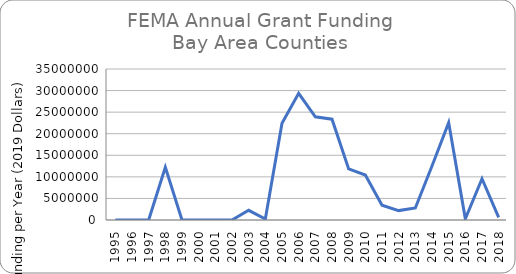
| Category | Series 0 |
|---|---|
| 1995.0 | 0 |
| 1996.0 | 0 |
| 1997.0 | 0 |
| 1998.0 | 12211945 |
| 1999.0 | 0 |
| 2000.0 | 0 |
| 2001.0 | 0 |
| 2002.0 | 0 |
| 2003.0 | 2249382 |
| 2004.0 | 239550 |
| 2005.0 | 22444776.969 |
| 2006.0 | 29353101 |
| 2007.0 | 23914910 |
| 2008.0 | 23373200 |
| 2009.0 | 11831172 |
| 2010.0 | 10422870 |
| 2011.0 | 3416166 |
| 2012.0 | 2178568 |
| 2013.0 | 2785290 |
| 2014.0 | 12514464 |
| 2015.0 | 22575018 |
| 2016.0 | 270480 |
| 2017.0 | 9566803 |
| 2018.0 | 622704 |